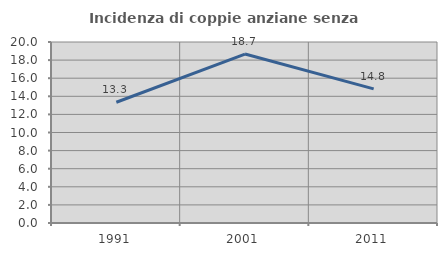
| Category | Incidenza di coppie anziane senza figli  |
|---|---|
| 1991.0 | 13.345 |
| 2001.0 | 18.669 |
| 2011.0 | 14.821 |